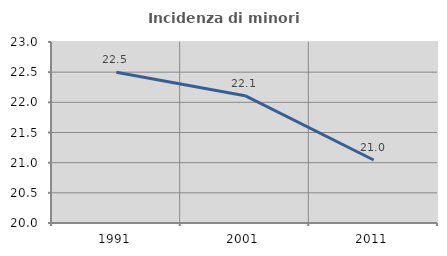
| Category | Incidenza di minori stranieri |
|---|---|
| 1991.0 | 22.5 |
| 2001.0 | 22.111 |
| 2011.0 | 21.044 |